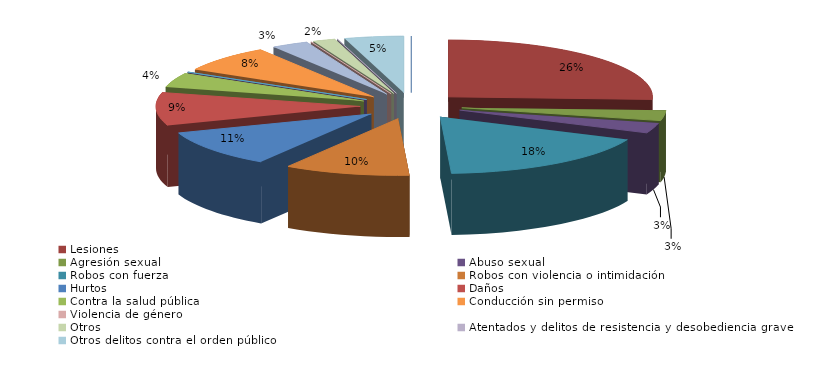
| Category | Series 0 |
|---|---|
| Homicidio/Asesinato dolosos | 0 |
| Lesiones | 44 |
| Agresión sexual | 5 |
| Abuso sexual | 5 |
| Robos con fuerza | 30 |
| Robos con violencia o intimidación | 17 |
| Hurtos | 18 |
| Daños | 16 |
| Contra la salud pública | 7 |
| Conduccción etílica/drogas | 0 |
| Conducción temeraria | 0 |
| Conducción sin permiso | 13 |
| Violencia doméstica | 5 |
| Violencia de género | 0 |
| Otros | 3 |
| Atentados y delitos de resistencia y desobediencia grave | 0 |
| Otros delitos contra el orden público | 8 |